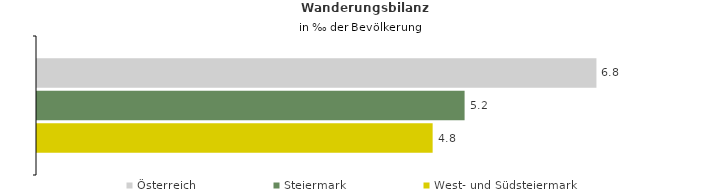
| Category | Österreich | Steiermark | West- und Südsteiermark |
|---|---|---|---|
| Wanderungsrate in ‰ der Bevölkerung, Periode 2015-2019 | 6.771 | 5.175 | 4.788 |